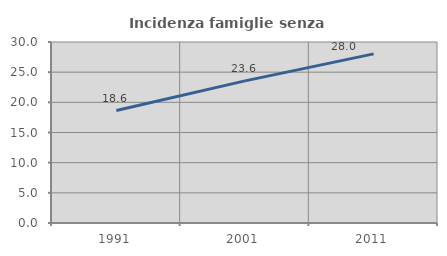
| Category | Incidenza famiglie senza nuclei |
|---|---|
| 1991.0 | 18.643 |
| 2001.0 | 23.554 |
| 2011.0 | 28.029 |